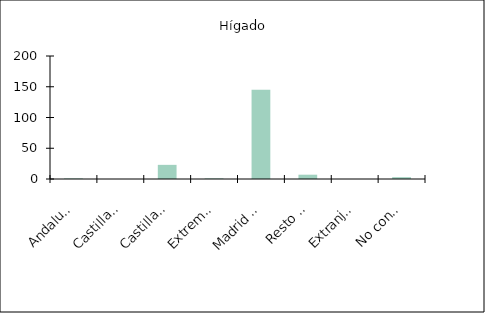
| Category | Hígado |
|---|---|
|    Andalucía | 1 |
|    Castilla y León | 0 |
|    Castilla-La Mancha | 23 |
|    Extremadura | 1 |
|    Madrid (Comunidad de) | 145 |
|    Resto de CCAA | 7 |
|    Extranjero | 0 |
|    No consta | 3 |